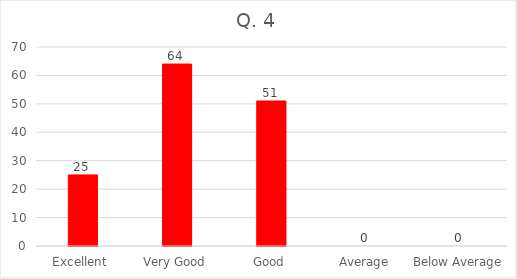
| Category | Series 0 |
|---|---|
| Excellent  | 25 |
| Very Good | 64 |
| Good | 51 |
| Average | 0 |
| Below Average | 0 |